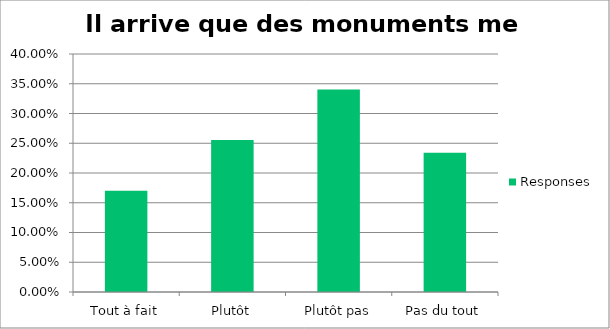
| Category | Responses |
|---|---|
| Tout à fait | 0.17 |
| Plutôt | 0.255 |
| Plutôt pas | 0.34 |
| Pas du tout | 0.234 |